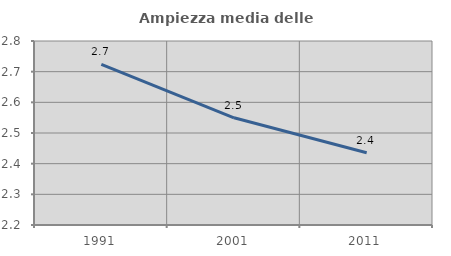
| Category | Ampiezza media delle famiglie |
|---|---|
| 1991.0 | 2.724 |
| 2001.0 | 2.55 |
| 2011.0 | 2.436 |